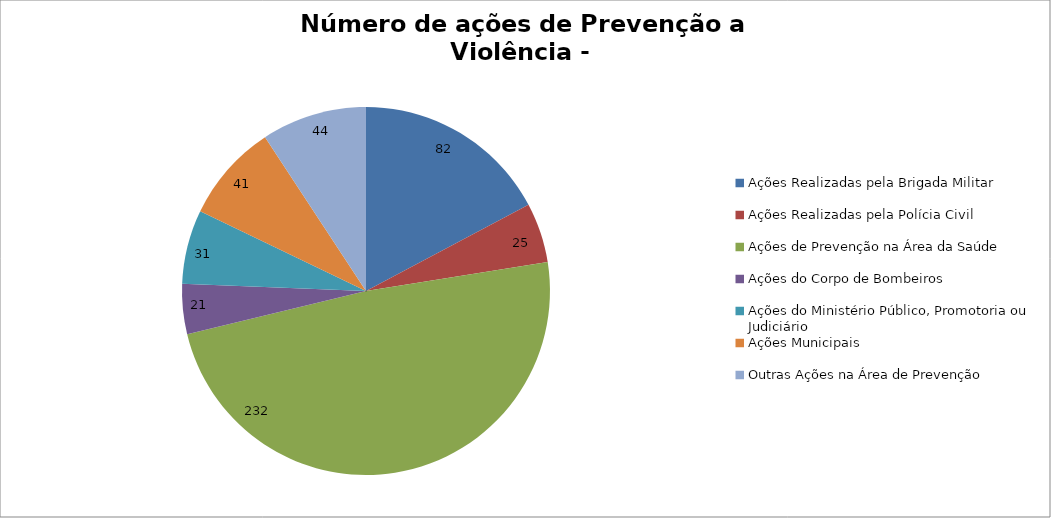
| Category | Número de Ações |
|---|---|
| Ações Realizadas pela Brigada Militar | 82 |
| Ações Realizadas pela Polícia Civil | 25 |
| Ações de Prevenção na Área da Saúde | 232 |
| Ações do Corpo de Bombeiros | 21 |
| Ações do Ministério Público, Promotoria ou Judiciário | 31 |
| Ações Municipais | 41 |
| Outras Ações na Área de Prevenção | 44 |